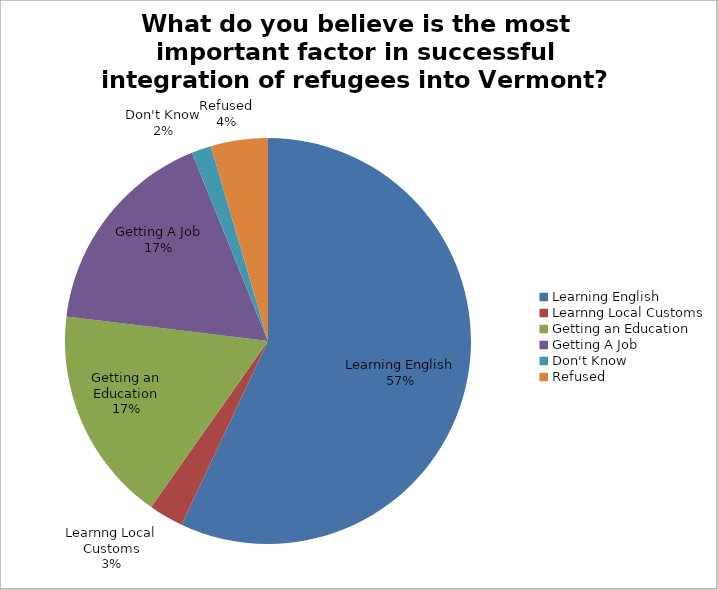
| Category | Frequency | Percent | Valid Percent | Cumulative Percent |
|---|---|---|---|---|
| Learning English | 289 | 46.7 | 57 | 57 |
| Learnng Local Customs | 14 | 2.3 | 2.8 | 59.8 |
| Getting an Education | 87 | 14.1 | 17.2 | 76.9 |
| Getting A Job | 86 | 13.9 | 17 | 93.9 |
| Don't Know | 8 | 1.3 | 1.6 | 95.5 |
| Refused | 23 | 3.7 | 4.5 | 100 |